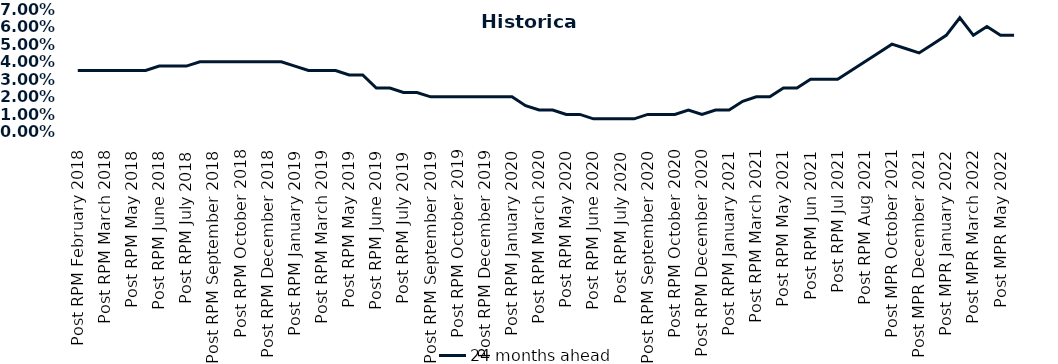
| Category | 24 months ahead |
|---|---|
| Post RPM February 2018 | 0.035 |
| Pre RPM March 2018 | 0.035 |
| Post RPM March 2018 | 0.035 |
| Pre RPM May 2018 | 0.035 |
| Post RPM May 2018 | 0.035 |
| Pre RPM June 2018 | 0.035 |
| Post RPM June 2018 | 0.038 |
| Pre RPM July 2018 | 0.038 |
| Post RPM July 2018 | 0.038 |
| Pre RPM September 2018 | 0.04 |
| Post RPM September 2018 | 0.04 |
| Pre RPM October 2018 | 0.04 |
| Post RPM October 2018 | 0.04 |
| Pre RPM December 2018 | 0.04 |
| Post RPM December 2018 | 0.04 |
| Pre RPM January 2019 | 0.04 |
| Post RPM January 2019 | 0.038 |
| Pre RPM March 2019 | 0.035 |
| Post RPM March 2019 | 0.035 |
| Pre RPM May 2019 | 0.035 |
| Post RPM May 2019 | 0.032 |
| Pre RPM June 2019 | 0.032 |
| Post RPM June 2019 | 0.025 |
| Pre RPM July 2019 | 0.025 |
| Post RPM July 2019 | 0.022 |
| Pre RPM September 2019 | 0.022 |
| Post RPM September 2019 | 0.02 |
| Pre RPM October 2019 | 0.02 |
| Post RPM October 2019 | 0.02 |
| Pre RPM December 2019 | 0.02 |
| Post RPM December 2019 | 0.02 |
| Pre RPM January 2020 | 0.02 |
| Post RPM January 2020 | 0.02 |
| Pre RPM March 2020 | 0.015 |
| Post RPM March 2020 | 0.012 |
| Pre RPM May 2020 | 0.012 |
| Post RPM May 2020 | 0.01 |
| Pre RPM June 2020 | 0.01 |
| Post RPM June 2020 | 0.008 |
| Pre RPM July 2020 | 0.008 |
| Post RPM July 2020 | 0.008 |
| Pre RPM September 2020 | 0.008 |
| Post RPM September 2020 | 0.01 |
| Pre RPM October 2020 | 0.01 |
| Post RPM October 2020 | 0.01 |
| Pre RPM December 2020 | 0.012 |
|  Post RPM December 2020 | 0.01 |
| Pre RPM January 2021 | 0.012 |
| Post RPM January 2021 | 0.012 |
|  Pre RPM March 2021 | 0.018 |
|  Post RPM March 2021 | 0.02 |
|  Pre RPM May 2021 | 0.02 |
|  Post RPM May 2021 | 0.025 |
|  Pre RPM Jun 2021 | 0.025 |
|   Post RPM Jun 2021 | 0.03 |
| Pre RPM Jul 2021 | 0.03 |
|  Post RPM Jul 2021 | 0.03 |
| Pre RPM Aug 2021 | 0.035 |
|  Post RPM Aug 2021 | 0.04 |
| Pre MPR October 2021 | 0.045 |
| Post MPR October 2021 | 0.05 |
| Pre MPR December 2021 | 0.048 |
| Post MPR December 2021 | 0.045 |
| Pre MPR January 2022 | 0.05 |
| Post MPR January 2022 | 0.055 |
| Pre MPR March 2022 | 0.065 |
| Post MPR March 2022 | 0.055 |
| Pre MPR May 2022 | 0.06 |
| Post MPR May 2022 | 0.055 |
| Pre MPR June 2022 | 0.055 |